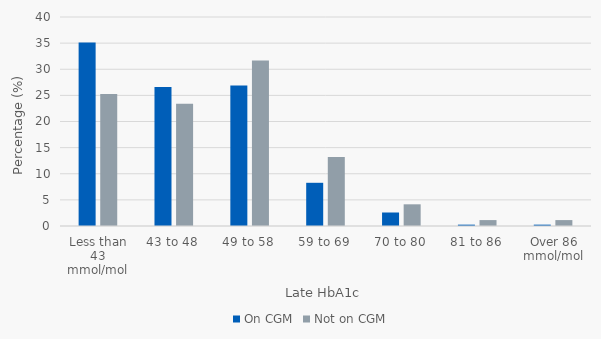
| Category | On CGM | Not on CGM |
|---|---|---|
| Less than 43 mmol/mol | 35.142 | 25.283 |
| 43 to 48 | 26.615 | 23.396 |
| 49 to 58 | 26.873 | 31.698 |
| 59 to 69 | 8.269 | 13.208 |
| 70 to 80 | 2.584 | 4.151 |
| 81 to 86 | 0.258 | 1.132 |
| Over 86 mmol/mol | 0.258 | 1.132 |